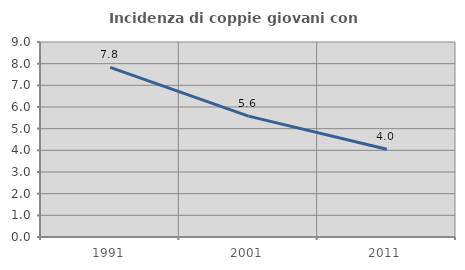
| Category | Incidenza di coppie giovani con figli |
|---|---|
| 1991.0 | 7.826 |
| 2001.0 | 5.579 |
| 2011.0 | 4.049 |